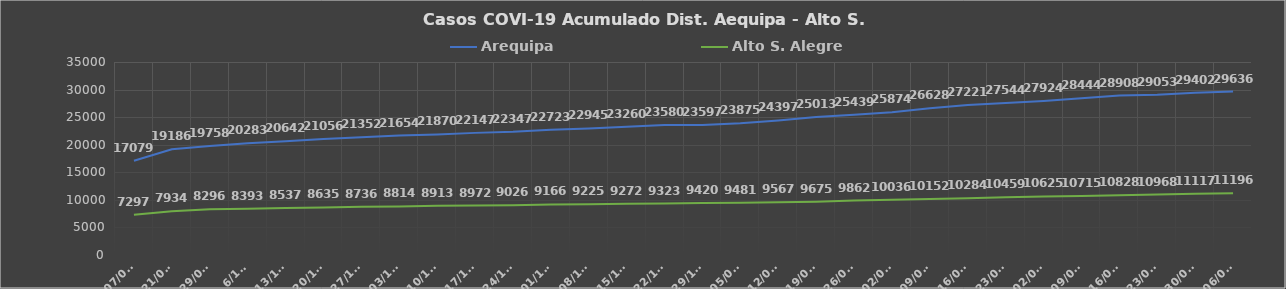
| Category | Arequipa | Alto S. Alegre |
|---|---|---|
| 07/09/ | 17079 | 7297 |
| 21/09/ | 19186 | 7934 |
| 29/09/ | 19758 | 8296 |
| 6/10/ | 20283 | 8393 |
| 13/10/ | 20642 | 8537 |
| 20/10/ | 21056 | 8635 |
| 27/10/ | 21352 | 8736 |
| 03/11/ | 21654 | 8814 |
| 10/11/ | 21870 | 8913 |
| 17/11/ | 22147 | 8972 |
| 24/11/ | 22347 | 9026 |
| 01/12/ | 22723 | 9166 |
| 08/12/ | 22945 | 9225 |
| 15/12/ | 23260 | 9272 |
| 22/12/ | 23580 | 9323 |
| 29/12/ | 23597 | 9420 |
| 05/01/ | 23875 | 9481 |
| 12/01/ | 24397 | 9567 |
| 19/01/ | 25013 | 9675 |
| 26/01/ | 25439 | 9862 |
| 02/02/ | 25874 | 10036 |
| 09/02/ | 26628 | 10152 |
| 16/02/ | 27221 | 10284 |
| 23/02/ | 27544 | 10459 |
| 02/03/ | 27924 | 10625 |
| 09/03/ | 28444 | 10715 |
| 16/03/ | 28908 | 10828 |
| 23/03/ | 29053 | 10968 |
| 30/03/ | 29402 | 11117 |
| 06/04/ | 29636 | 11196 |